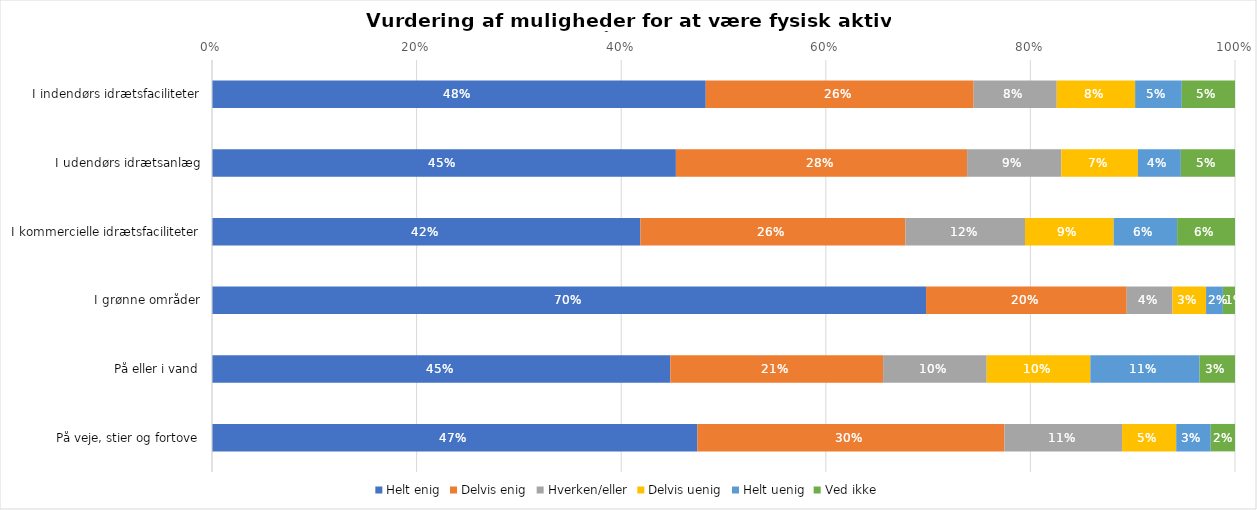
| Category | Helt enig | Delvis enig | Hverken/eller | Delvis uenig | Helt uenig | Ved ikke |
|---|---|---|---|---|---|---|
| I indendørs idrætsfaciliteter | 0.483 | 0.262 | 0.081 | 0.077 | 0.046 | 0.052 |
| I udendørs idrætsanlæg | 0.453 | 0.285 | 0.092 | 0.075 | 0.042 | 0.053 |
| I kommercielle idrætsfaciliteter | 0.419 | 0.259 | 0.117 | 0.087 | 0.062 | 0.057 |
| I grønne områder | 0.698 | 0.196 | 0.045 | 0.033 | 0.016 | 0.012 |
| På eller i vand | 0.448 | 0.208 | 0.101 | 0.101 | 0.107 | 0.035 |
| På veje, stier og fortove | 0.474 | 0.3 | 0.115 | 0.053 | 0.034 | 0.024 |